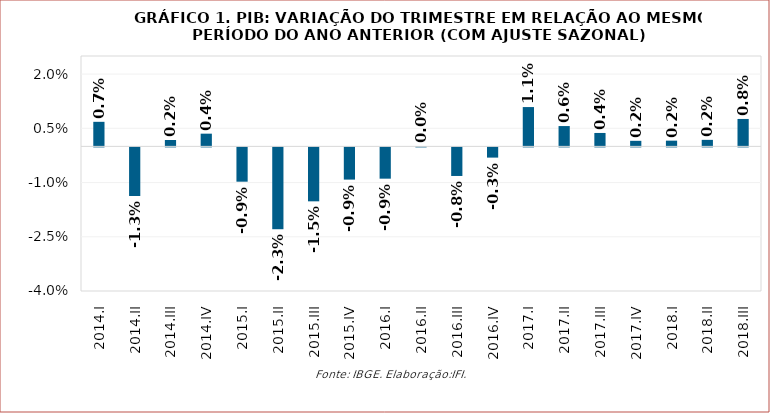
| Category | PIB |
|---|---|
| 2014.I | 0.007 |
| 2014.II | -0.013 |
| 2014.III | 0.002 |
| 2014.IV | 0.004 |
| 2015.I | -0.009 |
| 2015.II | -0.023 |
| 2015.III | -0.015 |
| 2015.IV | -0.009 |
| 2016.I | -0.009 |
| 2016.II | 0 |
| 2016.III | -0.008 |
| 2016.IV | -0.003 |
| 2017.I | 0.011 |
| 2017.II | 0.006 |
| 2017.III | 0.004 |
| 2017.IV | 0.002 |
| 2018.I | 0.002 |
| 2018.II | 0.002 |
| 2018.III | 0.008 |